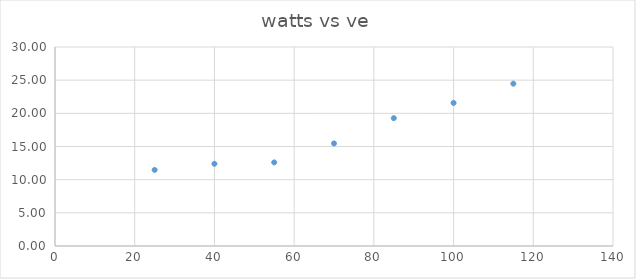
| Category | watts vs ve |
|---|---|
| 25.0 | 11.47 |
| 40.0 | 12.395 |
| 55.0 | 12.603 |
| 70.0 | 15.462 |
| 85.0 | 19.273 |
| 100.0 | 21.574 |
| 115.0 | 24.471 |